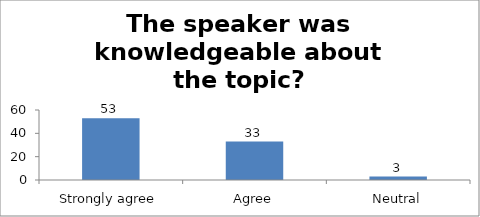
| Category | The speaker was knowledgeable about the topic? |
|---|---|
| Strongly agree | 53 |
| Agree | 33 |
| Neutral | 3 |